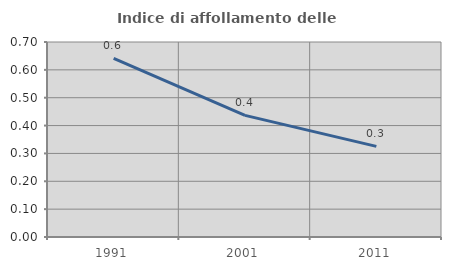
| Category | Indice di affollamento delle abitazioni  |
|---|---|
| 1991.0 | 0.641 |
| 2001.0 | 0.437 |
| 2011.0 | 0.325 |